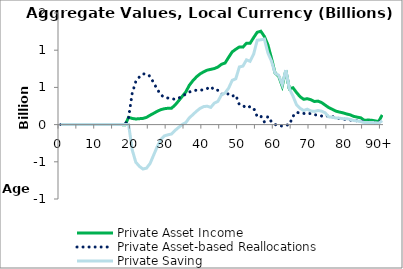
| Category | Private Asset Income | Private Asset-based Reallocations | Private Saving |
|---|---|---|---|
| 0 | 0 | 0 | 0 |
|  | 0 | 0 | 0 |
| 2 | 0 | 0 | 0 |
| 3 | 0 | 0 | 0 |
| 4 | 0 | 0 | 0 |
| 5 | 0 | 0 | 0 |
| 6 | 0 | 0 | 0 |
| 7 | 0 | 0 | 0 |
| 8 | 0 | 0 | 0 |
| 9 | 0 | 0 | 0 |
| 10 | 0 | 0 | 0 |
| 11 | 0 | 0 | 0 |
| 12 | 0 | 0 | 0 |
| 13 | 0 | 0 | 0 |
| 14 | 0 | 0 | 0 |
| 15 | 0 | 0 | 0 |
| 16 | 0 | 0 | 0 |
| 17 | 0 | 0 | 0 |
| 18 | -2.445 | -2.445 | 0 |
| 19 | 97.086 | 97.086 | 0 |
| 20 | 82.975 | 423.191 | -340.216 |
| 21 | 75.361 | 580.502 | -505.141 |
| 22 | 79.652 | 640.256 | -560.604 |
| 23 | 83.458 | 680.474 | -597.016 |
| 24 | 96.697 | 682.055 | -585.358 |
| 25 | 125.722 | 648.645 | -522.924 |
| 26 | 151.687 | 561.705 | -410.018 |
| 27 | 178.589 | 475.45 | -296.861 |
| 28 | 200.629 | 401.235 | -200.606 |
| 29 | 213.43 | 365.411 | -151.981 |
| 30 | 219.701 | 357.013 | -137.312 |
| 31 | 220.42 | 347.184 | -126.765 |
| 32 | 262.808 | 340.881 | -78.073 |
| 33 | 319.604 | 357.219 | -37.615 |
| 34 | 379.295 | 378.161 | 1.134 |
| 35 | 438.186 | 411.938 | 26.247 |
| 36 | 529.44 | 437.431 | 92.009 |
| 37 | 590.863 | 456.486 | 134.376 |
| 38 | 642.068 | 462.014 | 180.054 |
| 39 | 681.51 | 463.394 | 218.116 |
| 40 | 709.005 | 466.895 | 242.109 |
| 41 | 731.903 | 484.516 | 247.386 |
| 42 | 742.7 | 511.043 | 231.657 |
| 43 | 753.377 | 463.983 | 289.395 |
| 44 | 774.032 | 461.645 | 312.387 |
| 45 | 810.855 | 410.276 | 400.579 |
| 46 | 827.638 | 402.525 | 425.113 |
| 47 | 904.424 | 414.429 | 489.995 |
| 48 | 977.532 | 382.419 | 595.113 |
| 49 | 1012.727 | 397.107 | 615.62 |
| 50 | 1043.532 | 268.585 | 774.947 |
| 51 | 1041.372 | 254.922 | 786.45 |
| 52 | 1094.65 | 224.319 | 870.332 |
| 53 | 1092.436 | 241.784 | 850.651 |
| 54 | 1168.874 | 222.173 | 946.701 |
| 55 | 1240.709 | 106.378 | 1134.33 |
| 56 | 1255.043 | 115.444 | 1139.598 |
| 57 | 1185.149 | 36.033 | 1149.116 |
| 58 | 1070.935 | 108.996 | 961.939 |
| 59 | 890.035 | 36.993 | 853.042 |
| 60 | 692.886 | 0.625 | 692.261 |
| 61 | 650.814 | -11.44 | 662.254 |
| 62 | 517.087 | -19.68 | 536.768 |
| 63 | 726.45 | -6.801 | 733.251 |
| 64 | 481.027 | -2.779 | 483.806 |
| 65 | 495.385 | 111.077 | 384.307 |
| 66 | 431.773 | 164.606 | 267.167 |
| 67 | 374.953 | 155.806 | 219.148 |
| 68 | 340.004 | 150.608 | 189.396 |
| 69 | 348.219 | 141.292 | 206.927 |
| 70 | 334.967 | 151.342 | 183.626 |
| 71 | 310.355 | 133.076 | 177.279 |
| 72 | 315.741 | 126.31 | 189.432 |
| 73 | 296.854 | 115.76 | 181.094 |
| 74 | 263.282 | 104.279 | 159.003 |
| 75 | 229.168 | 124.426 | 104.741 |
| 76 | 206.458 | 108.034 | 98.424 |
| 77 | 181.405 | 91.747 | 89.658 |
| 78 | 168.633 | 81.697 | 86.935 |
| 79 | 158.156 | 78.48 | 79.676 |
| 80 | 143.159 | 63.118 | 80.041 |
| 81 | 132.027 | 61.603 | 70.424 |
| 82 | 110.78 | 55.588 | 55.193 |
| 83 | 100.384 | 51.552 | 48.832 |
| 84 | 90.938 | 50.353 | 40.585 |
| 85 | 57.858 | 30.155 | 27.703 |
| 86 | 61.024 | 32.377 | 28.647 |
| 87 | 59.138 | 29.328 | 29.81 |
| 88 | 49.816 | 24.773 | 25.043 |
| 89 | 41.632 | 21.694 | 19.938 |
| 90+ | 129.962 | 77.938 | 52.024 |